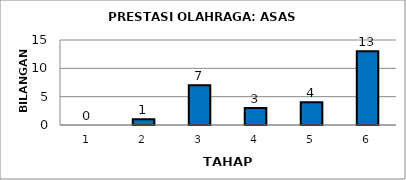
| Category | Series 0 |
|---|---|
| 1.0 | 0 |
| 2.0 | 1 |
| 3.0 | 7 |
| 4.0 | 3 |
| 5.0 | 4 |
| 6.0 | 13 |